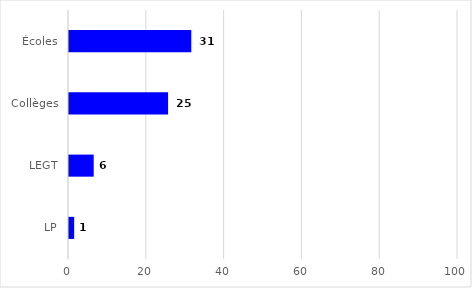
| Category | Series 0 |
|---|---|
| Écoles | 31.419 |
| Collèges | 25.467 |
| LEGT | 6.345 |
| LP | 1.328 |